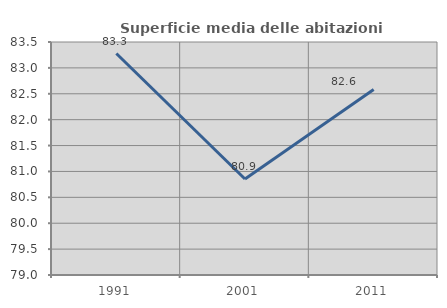
| Category | Superficie media delle abitazioni occupate |
|---|---|
| 1991.0 | 83.277 |
| 2001.0 | 80.855 |
| 2011.0 | 82.583 |